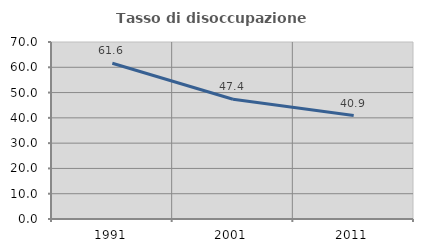
| Category | Tasso di disoccupazione giovanile  |
|---|---|
| 1991.0 | 61.587 |
| 2001.0 | 47.368 |
| 2011.0 | 40.909 |